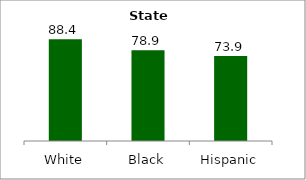
| Category | Series 0 |
|---|---|
| White | 88.447 |
| Black | 78.853 |
| Hispanic | 73.878 |